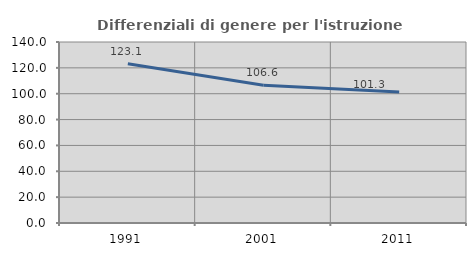
| Category | Differenziali di genere per l'istruzione superiore |
|---|---|
| 1991.0 | 123.103 |
| 2001.0 | 106.605 |
| 2011.0 | 101.334 |